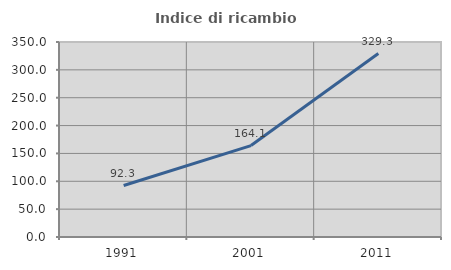
| Category | Indice di ricambio occupazionale  |
|---|---|
| 1991.0 | 92.336 |
| 2001.0 | 164.092 |
| 2011.0 | 329.319 |